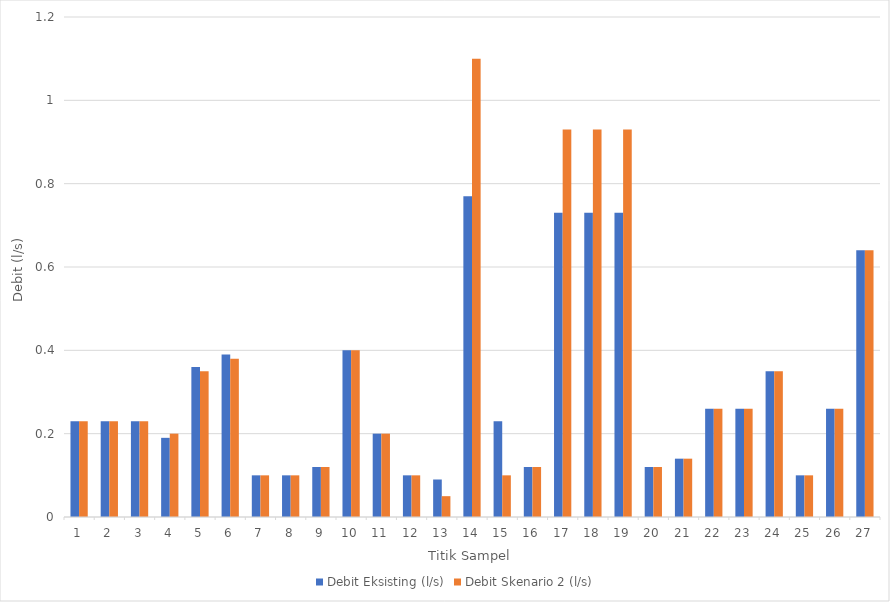
| Category | Debit Eksisting (l/s) | Debit Skenario 2 (l/s) |
|---|---|---|
| 0 | 0.23 | 0.23 |
| 1 | 0.23 | 0.23 |
| 2 | 0.23 | 0.23 |
| 3 | 0.19 | 0.2 |
| 4 | 0.36 | 0.35 |
| 5 | 0.39 | 0.38 |
| 6 | 0.1 | 0.1 |
| 7 | 0.1 | 0.1 |
| 8 | 0.12 | 0.12 |
| 9 | 0.4 | 0.4 |
| 10 | 0.2 | 0.2 |
| 11 | 0.1 | 0.1 |
| 12 | 0.09 | 0.05 |
| 13 | 0.77 | 1.1 |
| 14 | 0.23 | 0.1 |
| 15 | 0.12 | 0.12 |
| 16 | 0.73 | 0.93 |
| 17 | 0.73 | 0.93 |
| 18 | 0.73 | 0.93 |
| 19 | 0.12 | 0.12 |
| 20 | 0.14 | 0.14 |
| 21 | 0.26 | 0.26 |
| 22 | 0.26 | 0.26 |
| 23 | 0.35 | 0.35 |
| 24 | 0.1 | 0.1 |
| 25 | 0.26 | 0.26 |
| 26 | 0.64 | 0.64 |